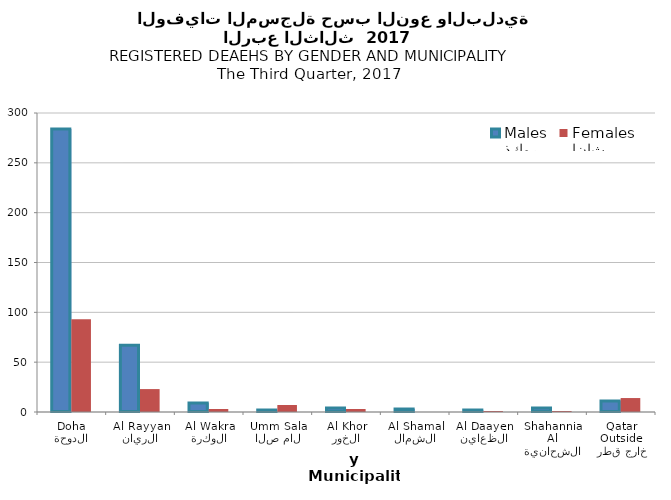
| Category | ذكور
Males | إناث
Females |
|---|---|---|
| الدوحة
Doha | 284 | 93 |
| الريان
Al Rayyan | 67 | 23 |
| الوكرة
Al Wakra | 9 | 3 |
| ام صلال
Umm Salal | 2 | 7 |
| الخور
Al Khor | 4 | 3 |
| الشمال
Al Shamal | 3 | 0 |
| الظعاين
Al Daayen | 2 | 1 |
| الشحانية
Al Shahannia | 4 | 1 |
| خارج قطر
Outside Qatar | 11 | 14 |